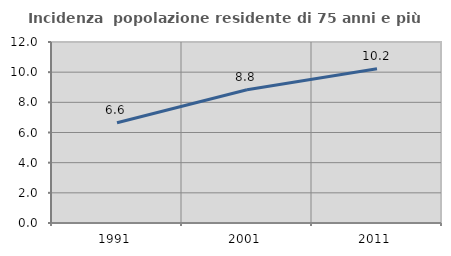
| Category | Incidenza  popolazione residente di 75 anni e più |
|---|---|
| 1991.0 | 6.647 |
| 2001.0 | 8.839 |
| 2011.0 | 10.23 |